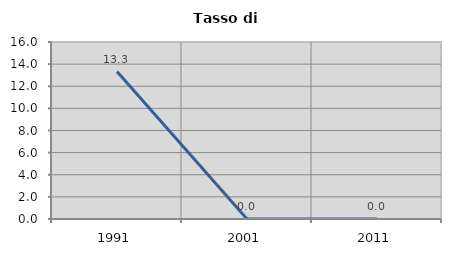
| Category | Tasso di disoccupazione   |
|---|---|
| 1991.0 | 13.333 |
| 2001.0 | 0 |
| 2011.0 | 0 |